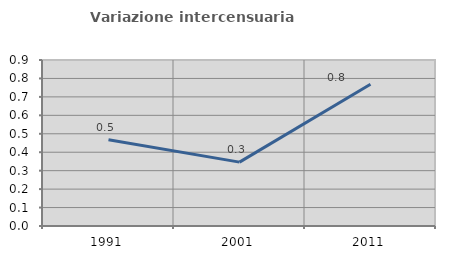
| Category | Variazione intercensuaria annua |
|---|---|
| 1991.0 | 0.468 |
| 2001.0 | 0.346 |
| 2011.0 | 0.768 |